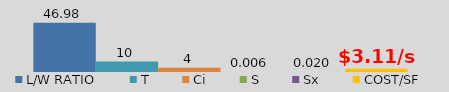
| Category | L/W RATIO | T | Ci | S | Sx | COST/SF |
|---|---|---|---|---|---|---|
| 0 | 46.977 | 10 | 4 | 0.006 | 0.02 | 3.11 |